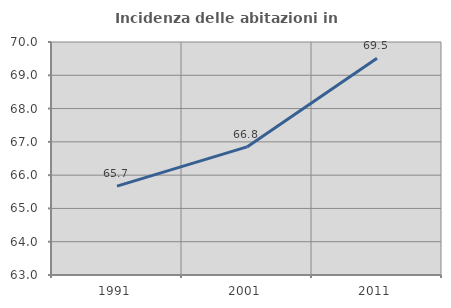
| Category | Incidenza delle abitazioni in proprietà  |
|---|---|
| 1991.0 | 65.668 |
| 2001.0 | 66.849 |
| 2011.0 | 69.514 |